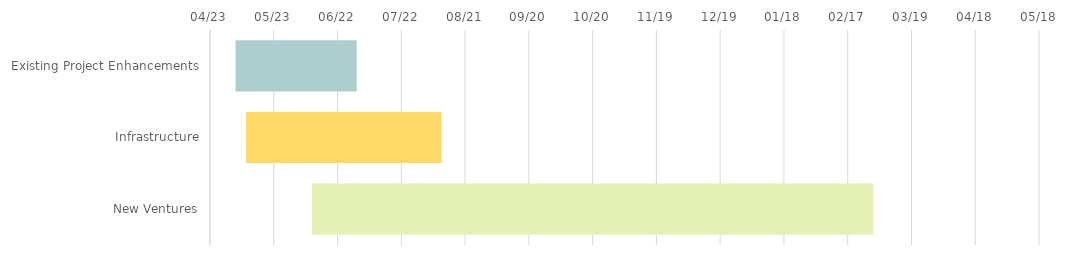
| Category | BEGIN | Duration |
|---|---|---|
| Existing Project Enhancements | 2025-05-05 | 57 |
| Infrastructure | 2025-05-10 | 92 |
| New Ventures | 2025-06-10 | 264 |